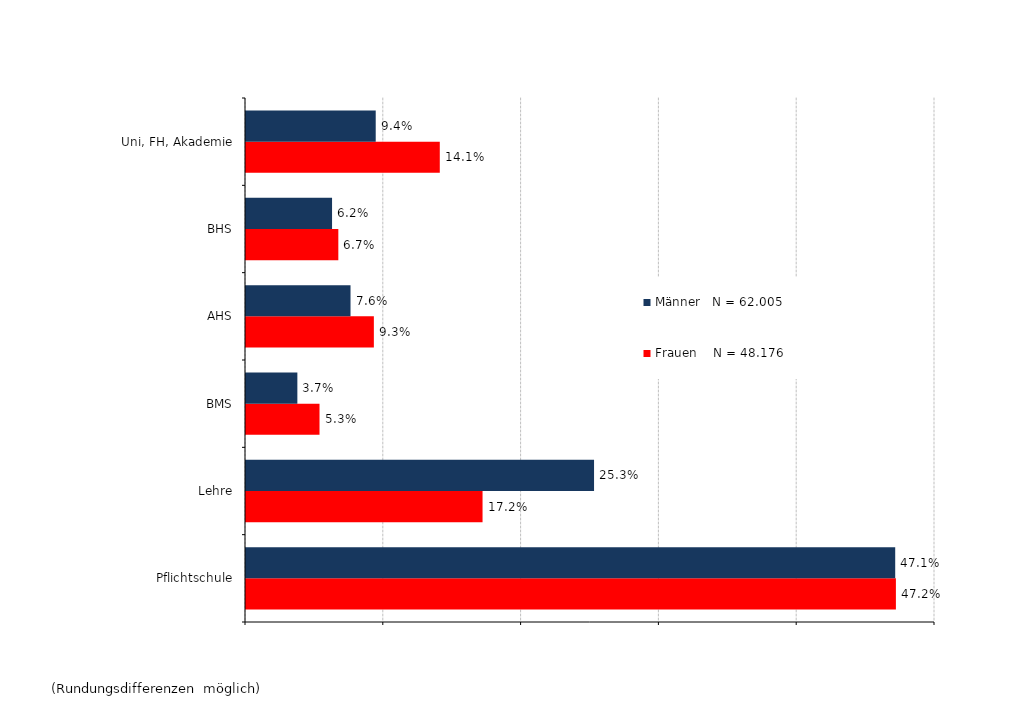
| Category | Frauen    N = 48.176 | Männer   N = 62.005 |
|---|---|---|
| Pflichtschule | 0.472 | 0.471 |
| Lehre | 0.172 | 0.253 |
| BMS | 0.053 | 0.037 |
| AHS | 0.093 | 0.076 |
| BHS | 0.067 | 0.062 |
| Uni, FH, Akademie | 0.141 | 0.094 |